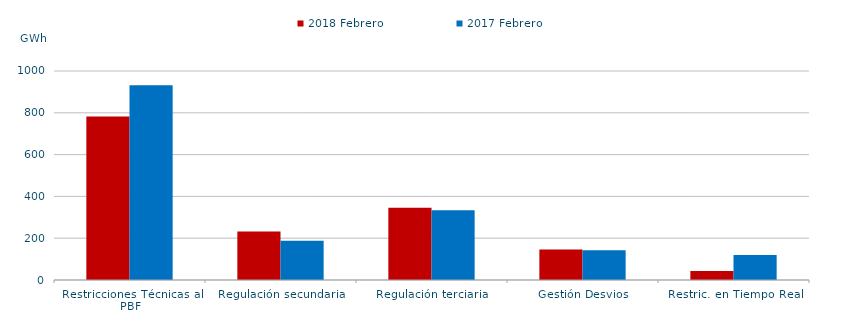
| Category | 2018 | 2017 |
|---|---|---|
| Restricciones Técnicas al PBF | 782.641 | 931.503 |
| Regulación secundaria | 231.755 | 188.122 |
| Regulación terciaria | 345.853 | 334.301 |
| Gestión Desvios | 146.18 | 142.445 |
| Restric. en Tiempo Real | 43.415 | 120.124 |